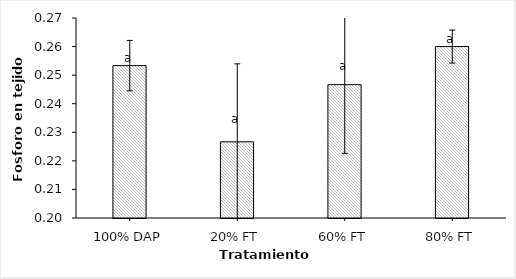
| Category | P |
|---|---|
| 100% DAP | 0.253 |
| 20% FT | 0.227 |
| 60% FT | 0.247 |
| 80% FT | 0.26 |